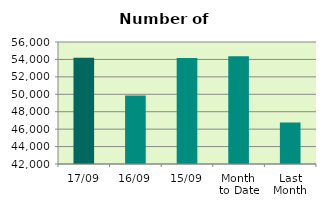
| Category | Series 0 |
|---|---|
| 17/09 | 54198 |
| 16/09 | 49864 |
| 15/09 | 54152 |
| Month 
to Date | 54357.846 |
| Last
Month | 46763.238 |